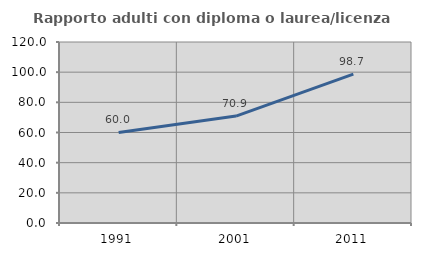
| Category | Rapporto adulti con diploma o laurea/licenza media  |
|---|---|
| 1991.0 | 60.039 |
| 2001.0 | 70.881 |
| 2011.0 | 98.656 |